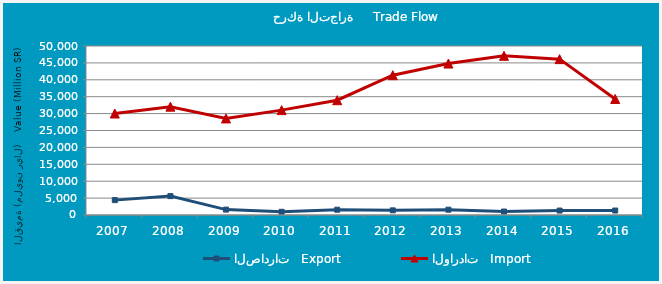
| Category | الصادرات   Export | الواردات   Import |
|---|---|---|
| 2007.0 | 4401.197 | 30021.907 |
| 2008.0 | 5588.091 | 32047.11 |
| 2009.0 | 1597.557 | 28572.398 |
| 2010.0 | 951.752 | 31032.432 |
| 2011.0 | 1559.715 | 33964.07 |
| 2012.0 | 1377.559 | 41367.327 |
| 2013.0 | 1570.407 | 44811.962 |
| 2014.0 | 1025.672 | 47092.831 |
| 2015.0 | 1311.44 | 46115.773 |
| 2016.0 | 1317.634 | 34330.967 |